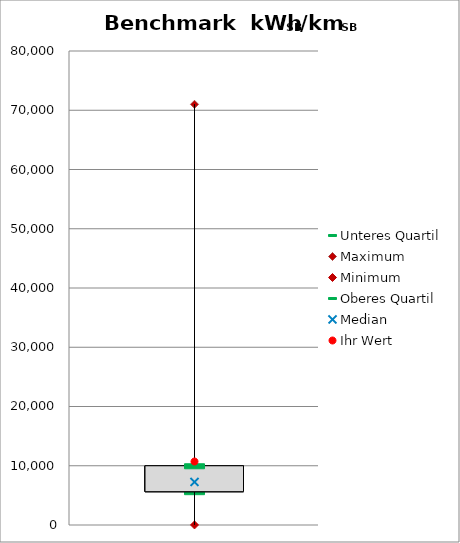
| Category | Unteres Quartil | Maximum | Minimum | Oberes Quartil |
|---|---|---|---|---|
| kWhSB/kmSB | 5623.576 | 71006 | 8.214 | 10000 |